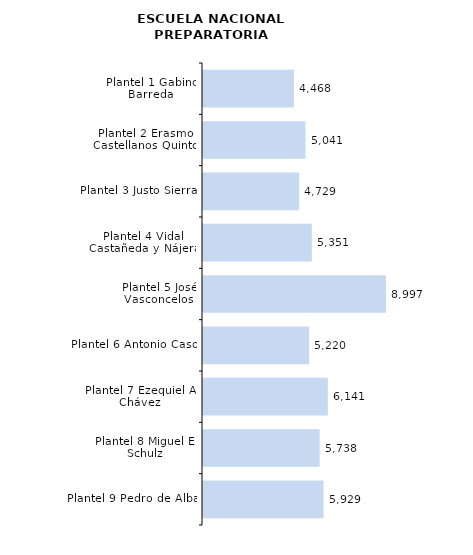
| Category | Series 0 |
|---|---|
| Plantel 9 Pedro de Alba | 5929 |
| Plantel 8 Miguel E. Schulz | 5738 |
| Plantel 7 Ezequiel A. Chávez | 6141 |
| Plantel 6 Antonio Caso | 5220 |
| Plantel 5 José Vasconcelos | 8997 |
| Plantel 4 Vidal Castañeda y Nájera | 5351 |
| Plantel 3 Justo Sierra | 4729 |
| Plantel 2 Erasmo Castellanos Quinto | 5041 |
| Plantel 1 Gabino Barreda | 4468 |